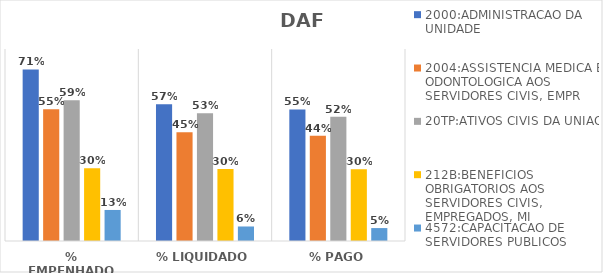
| Category | 2000:ADMINISTRACAO DA UNIDADE | 2004:ASSISTENCIA MEDICA E ODONTOLOGICA AOS SERVIDORES CIVIS, EMPR | 20TP:ATIVOS CIVIS DA UNIAO | 212B:BENEFICIOS OBRIGATORIOS AOS SERVIDORES CIVIS, EMPREGADOS, MI | 4572:CAPACITACAO DE SERVIDORES PUBLICOS FEDERAIS EM PROCESSO DE Q |
|---|---|---|---|---|---|
| % EMPENHADO | 0.715 | 0.549 | 0.587 | 0.303 | 0.129 |
| % LIQUIDADO | 0.569 | 0.453 | 0.532 | 0.3 | 0.06 |
| % PAGO | 0.548 | 0.439 | 0.518 | 0.299 | 0.054 |